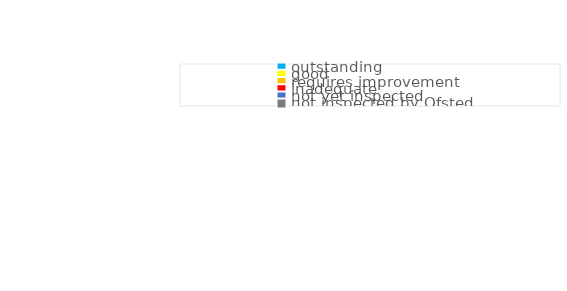
| Category | Series 0 |
|---|---|
| outstanding | 0 |
| good | 0 |
| requires improvement | 0 |
| inadequate | 0 |
| not yet inspected | 0 |
| not inspected by Ofsted | 0 |